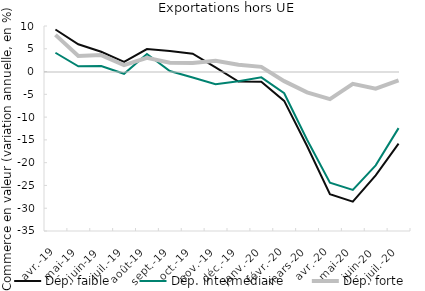
| Category | Dép. faible | Dép. intermédiaire | Dép. forte |
|---|---|---|---|
| 2019-04-01 | 9.235 | 4.129 | 8.046 |
| 2019-05-01 | 5.995 | 1.165 | 3.424 |
| 2019-06-01 | 4.34 | 1.211 | 3.618 |
| 2019-07-01 | 2.099 | -0.489 | 1.416 |
| 2019-08-01 | 4.927 | 3.858 | 3.007 |
| 2019-09-01 | 4.514 | 0.12 | 1.95 |
| 2019-10-01 | 3.928 | -1.307 | 1.872 |
| 2019-11-01 | 0.916 | -2.798 | 2.345 |
| 2019-12-01 | -2.197 | -2.119 | 1.485 |
| 2020-01-01 | -2.227 | -1.274 | 1.032 |
| 2020-02-01 | -6.441 | -4.759 | -2.111 |
| 2020-03-01 | -16.349 | -14.976 | -4.571 |
| 2020-04-01 | -26.932 | -24.404 | -6.056 |
| 2020-05-01 | -28.571 | -25.965 | -2.71 |
| 2020-06-01 | -22.787 | -20.592 | -3.763 |
| 2020-07-01 | -15.834 | -12.42 | -1.936 |